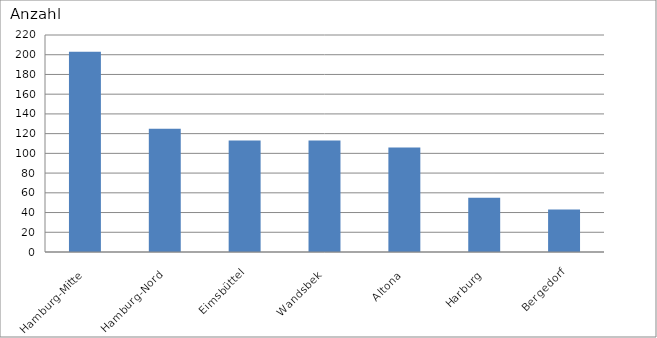
| Category | Hamburg-Mitte |
|---|---|
| Hamburg-Mitte | 203 |
| Hamburg-Nord | 125 |
| Eimsbüttel | 113 |
| Wandsbek | 113 |
| Altona | 106 |
| Harburg | 55 |
| Bergedorf | 43 |